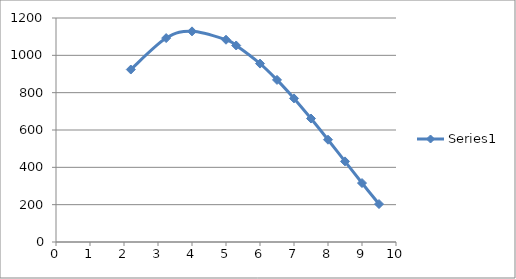
| Category | Series 0 |
|---|---|
| 2.2 | 923.956 |
| 3.24 | 1092.38 |
| 4.0 | 1128.4 |
| 5.0 | 1083.5 |
| 5.3 | 1052.792 |
| 6.0 | 955.8 |
| 6.5 | 868.4 |
| 7.0 | 769.3 |
| 7.5 | 661.5 |
| 8.0 | 548 |
| 8.5 | 431.8 |
| 9.0 | 315.9 |
| 9.5 | 203.3 |